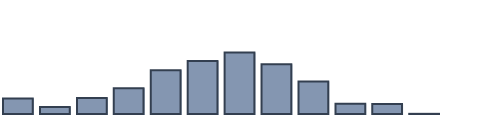
| Category | Series 0 |
|---|---|
| 0 | 4.773 |
| 1 | 2.174 |
| 2 | 4.904 |
| 3 | 7.94 |
| 4 | 13.452 |
| 5 | 16.267 |
| 6 | 18.916 |
| 7 | 15.297 |
| 8 | 9.995 |
| 9 | 3.141 |
| 10 | 3.087 |
| 11 | 0.052 |
| 12 | 0 |